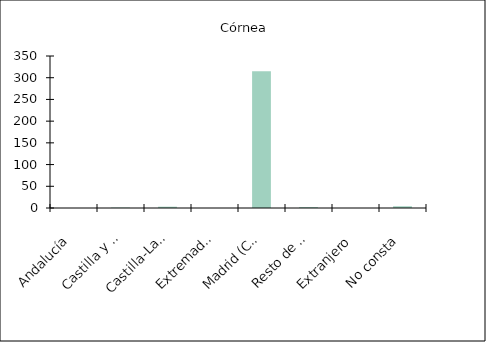
| Category | Córnea |
|---|---|
|    Andalucía | 0 |
|    Castilla y León | 1 |
|    Castilla-La Mancha | 3 |
|    Extremadura | 0 |
|    Madrid (Comunidad de) | 315 |
|    Resto de CCAA | 2 |
|    Extranjero | 0 |
|    No consta | 4 |